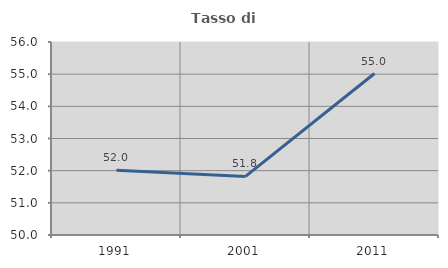
| Category | Tasso di occupazione   |
|---|---|
| 1991.0 | 52.013 |
| 2001.0 | 51.821 |
| 2011.0 | 55.02 |